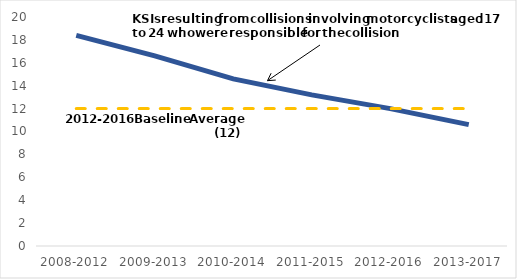
| Category | Series 0 | Series 1 |
|---|---|---|
| 2008-2012 | 18.4 | 12 |
| 2009-2013 | 16.6 | 12 |
| 2010-2014 | 14.6 | 12 |
| 2011-2015 | 13.2 | 12 |
| 2012-2016 | 12 | 12 |
| 2013-2017 | 10.6 | 12 |